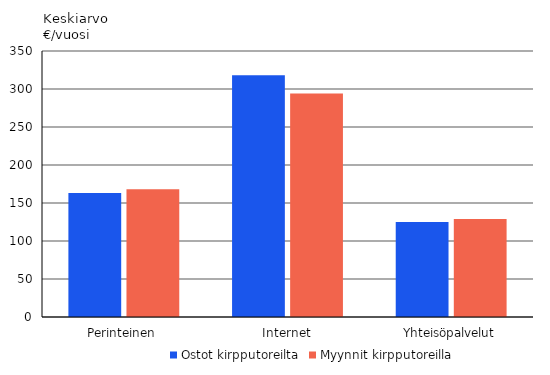
| Category | Ostot kirpputoreilta | Myynnit kirpputoreilla |
|---|---|---|
| Perinteinen | 163 | 168 |
| Internet | 318 | 294 |
| Yhteisöpalvelut | 125 | 129 |